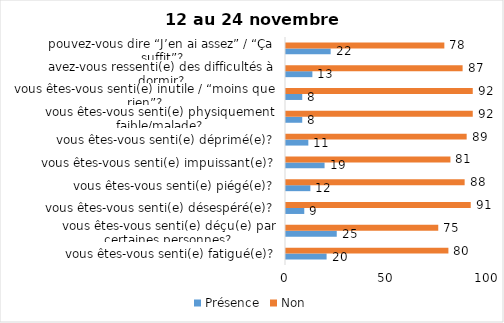
| Category | Présence | Non |
|---|---|---|
| vous êtes-vous senti(e) fatigué(e)? | 20 | 80 |
| vous êtes-vous senti(e) déçu(e) par certaines personnes? | 25 | 75 |
| vous êtes-vous senti(e) désespéré(e)? | 9 | 91 |
| vous êtes-vous senti(e) piégé(e)? | 12 | 88 |
| vous êtes-vous senti(e) impuissant(e)? | 19 | 81 |
| vous êtes-vous senti(e) déprimé(e)? | 11 | 89 |
| vous êtes-vous senti(e) physiquement faible/malade? | 8 | 92 |
| vous êtes-vous senti(e) inutile / “moins que rien”? | 8 | 92 |
| avez-vous ressenti(e) des difficultés à dormir? | 13 | 87 |
| pouvez-vous dire “J’en ai assez” / “Ça suffit”? | 22 | 78 |